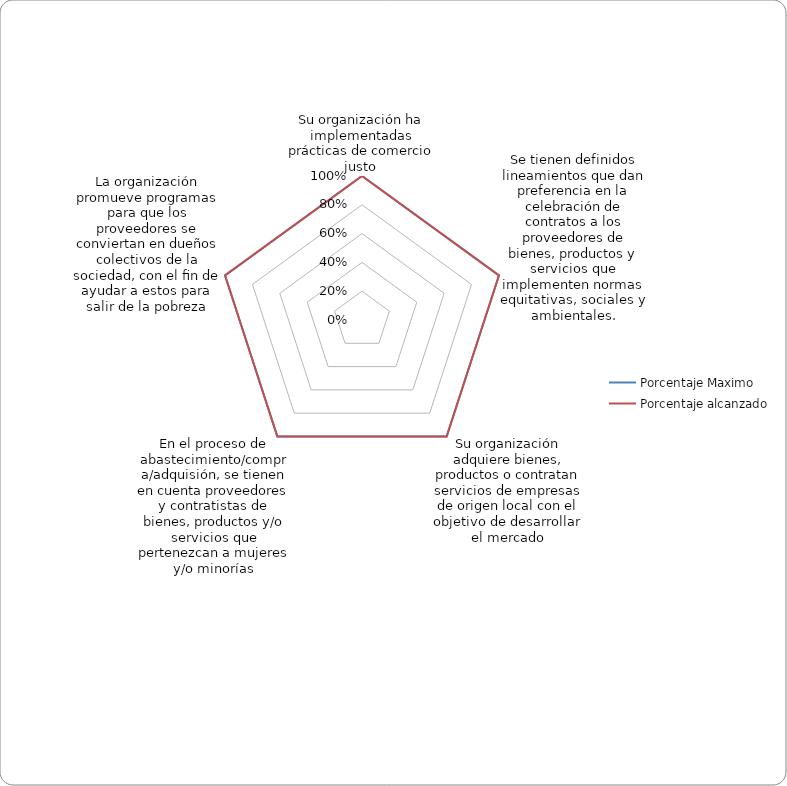
| Category | Porcentaje Maximo | Porcentaje alcanzado |
|---|---|---|
| Su organización ha implementadas prácticas de comercio justo  | 1 | 1 |
| Se tienen definidos lineamientos que dan preferencia en la celebración de contratos a los proveedores de bienes, productos y servicios que implementen normas equitativas, sociales y ambientales. | 1 | 1 |
| Su organización adquiere bienes, productos o contratan servicios de empresas de origen local con el objetivo de desarrollar el mercado | 1 | 1 |
| En el proceso de abastecimiento/compra/adquisión, se tienen en cuenta proveedores y contratistas de bienes, productos y/o servicios que pertenezcan a mujeres y/o minorías | 1 | 1 |
| La organización promueve programas para que los proveedores se conviertan en dueños colectivos de la sociedad, con el ﬁn de ayudar a estos para salir de la pobreza | 1 | 1 |